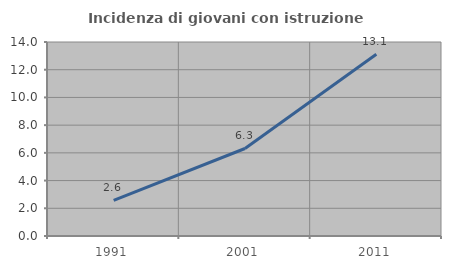
| Category | Incidenza di giovani con istruzione universitaria |
|---|---|
| 1991.0 | 2.564 |
| 2001.0 | 6.316 |
| 2011.0 | 13.115 |